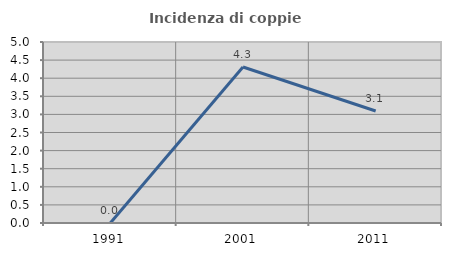
| Category | Incidenza di coppie miste |
|---|---|
| 1991.0 | 0 |
| 2001.0 | 4.31 |
| 2011.0 | 3.093 |